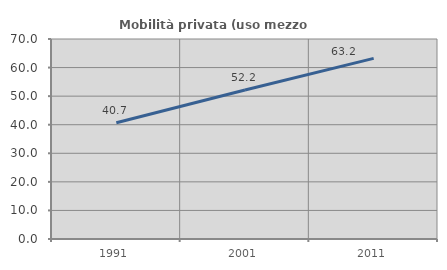
| Category | Mobilità privata (uso mezzo privato) |
|---|---|
| 1991.0 | 40.707 |
| 2001.0 | 52.156 |
| 2011.0 | 63.231 |